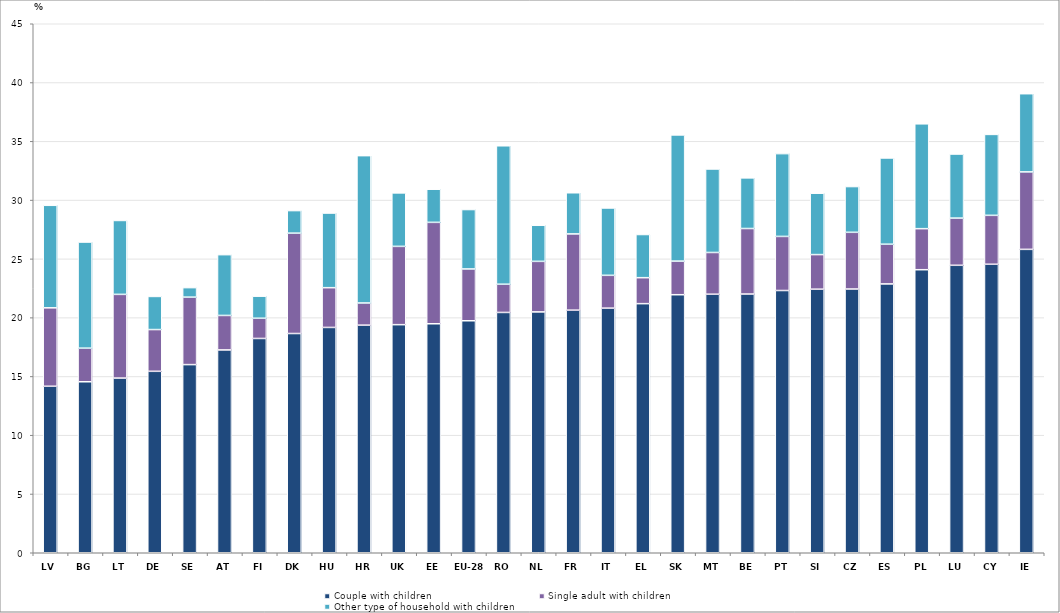
| Category | Couple with children  | Single adult with children  | Other type of household with children  |
|---|---|---|---|
| LV | 14.164 | 6.672 | 8.721 |
| BG | 14.546 | 2.858 | 9.025 |
| LT | 14.86 | 7.12 | 6.287 |
| DE | 15.435 | 3.551 | 2.817 |
| SE | 16.005 | 5.739 | 0.809 |
| AT | 17.255 | 2.932 | 5.172 |
| FI | 18.229 | 1.718 | 1.879 |
| DK | 18.65 | 8.538 | 1.919 |
| HU | 19.167 | 3.382 | 6.347 |
| HR | 19.361 | 1.887 | 12.534 |
| UK | 19.402 | 6.661 | 4.548 |
| EE | 19.479 | 8.627 | 2.816 |
| EU-28 | 19.735 | 4.408 | 5.052 |
| RO | 20.442 | 2.4 | 11.777 |
| NL | 20.49 | 4.299 | 3.069 |
| FR | 20.637 | 6.487 | 3.5 |
| IT | 20.809 | 2.791 | 5.729 |
| EL | 21.19 | 2.208 | 3.673 |
| SK | 21.95 | 2.86 | 10.734 |
| MT | 21.993 | 3.551 | 7.101 |
| BE | 22.009 | 5.574 | 4.308 |
| PT | 22.309 | 4.601 | 7.043 |
| SI | 22.421 | 2.942 | 5.219 |
| CZ | 22.436 | 4.824 | 3.891 |
| ES | 22.87 | 3.377 | 7.337 |
| PL | 24.076 | 3.492 | 8.919 |
| LU | 24.453 | 4.016 | 5.447 |
| CY | 24.541 | 4.162 | 6.885 |
| IE | 25.809 | 6.591 | 6.65 |